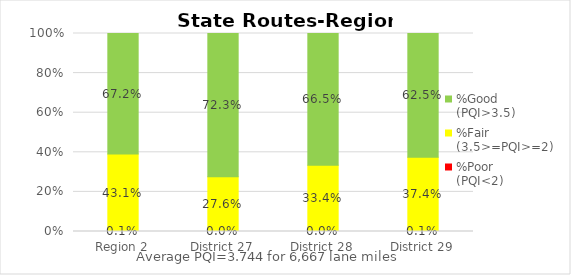
| Category | %Poor
(PQI<2) | %Fair
(3.5>=PQI>=2) | %Good
(PQI>3.5) |
|---|---|---|---|
| Region 2 | 0.001 | 0.431 | 0.672 |
| District 27 | 0 | 0.276 | 0.723 |
| District 28 | 0 | 0.334 | 0.665 |
| District 29 | 0.001 | 0.374 | 0.625 |